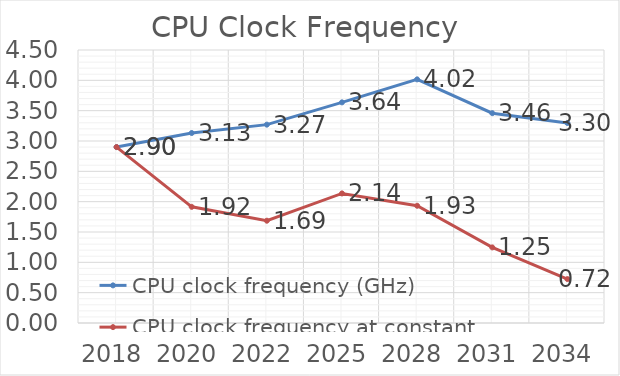
| Category | CPU clock frequency (GHz) | CPU clock frequency at constant power density (GHz) |
|---|---|---|
| 2018.0 | 2.9 | 2.9 |
| 2020.0 | 3.132 | 1.915 |
| 2022.0 | 3.27 | 1.686 |
| 2025.0 | 3.637 | 2.136 |
| 2028.0 | 4.016 | 1.933 |
| 2031.0 | 3.459 | 1.246 |
| 2034.0 | 3.296 | 0.724 |